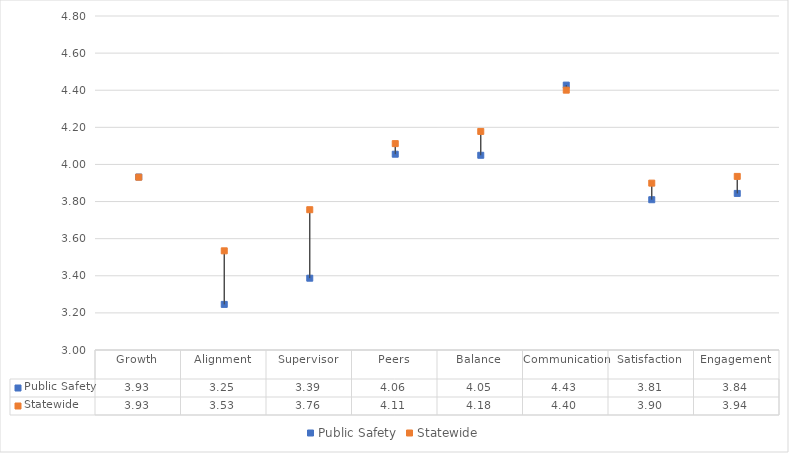
| Category | Public Safety | Statewide |
|---|---|---|
| Growth | 3.932 | 3.931 |
| Alignment | 3.246 | 3.534 |
| Supervisor | 3.387 | 3.756 |
| Peers | 4.055 | 4.112 |
| Balance | 4.049 | 4.178 |
| Communication | 4.427 | 4.4 |
| Satisfaction | 3.81 | 3.899 |
| Engagement | 3.844 | 3.936 |